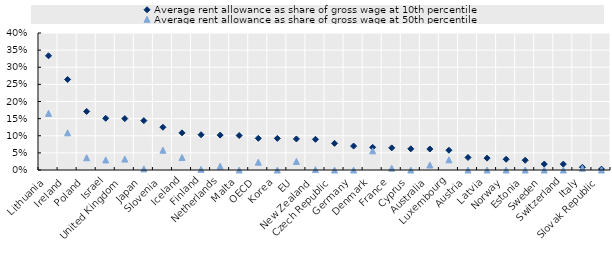
| Category | Average rent allowance as share of gross wage at 10th percentile | Average rent allowance as share of gross wage at 50th percentile |
|---|---|---|
| Lithuania | 0.333 | 0.165 |
| Ireland | 0.264 | 0.109 |
| Poland | 0.171 | 0.036 |
| Israel | 0.151 | 0.029 |
| United Kingdom | 0.15 | 0.032 |
| Japan | 0.144 | 0.003 |
| Slovenia | 0.125 | 0.058 |
| Iceland | 0.108 | 0.036 |
| Finland | 0.103 | 0.002 |
| Netherlands | 0.102 | 0.011 |
| Malta | 0.101 | 0 |
| OECD | 0.093 | 0.023 |
| Korea | 0.092 | 0 |
| EU | 0.091 | 0.025 |
| New Zealand | 0.09 | 0.001 |
| Czech Republic | 0.078 | 0 |
| Germany | 0.07 | 0 |
| Denmark | 0.066 | 0.056 |
| France | 0.065 | 0.005 |
| Cyprus | 0.062 | 0 |
| Australia | 0.061 | 0.015 |
| Luxembourg | 0.058 | 0.03 |
| Austria | 0.037 | 0 |
| Latvia | 0.035 | 0 |
| Norway | 0.031 | 0 |
| Estonia | 0.029 | 0 |
| Sweden | 0.017 | 0 |
| Switzerland | 0.017 | 0 |
| Italy | 0.008 | 0.005 |
| Slovak Republic | 0.003 | 0 |